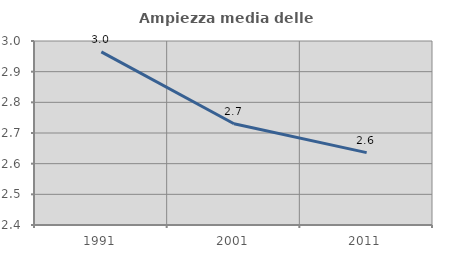
| Category | Ampiezza media delle famiglie |
|---|---|
| 1991.0 | 2.965 |
| 2001.0 | 2.73 |
| 2011.0 | 2.636 |